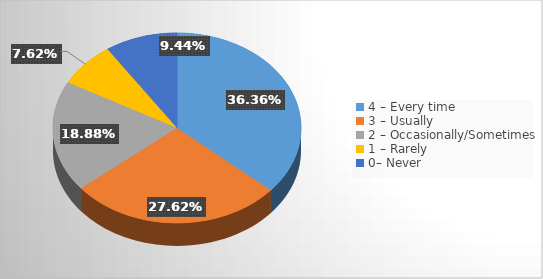
| Category | Series 0 |
|---|---|
| 4 – Every time  | 0.364 |
| 3 – Usually    | 0.276 |
| 2 – Occasionally/Sometimes   | 0.189 |
| 1 – Rarely    | 0.076 |
| 0– Never | 0.094 |